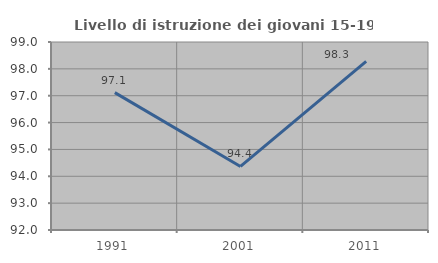
| Category | Livello di istruzione dei giovani 15-19 anni |
|---|---|
| 1991.0 | 97.115 |
| 2001.0 | 94.366 |
| 2011.0 | 98.276 |